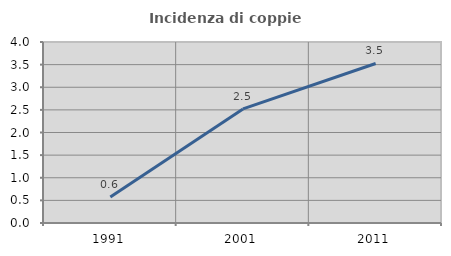
| Category | Incidenza di coppie miste |
|---|---|
| 1991.0 | 0.572 |
| 2001.0 | 2.52 |
| 2011.0 | 3.525 |